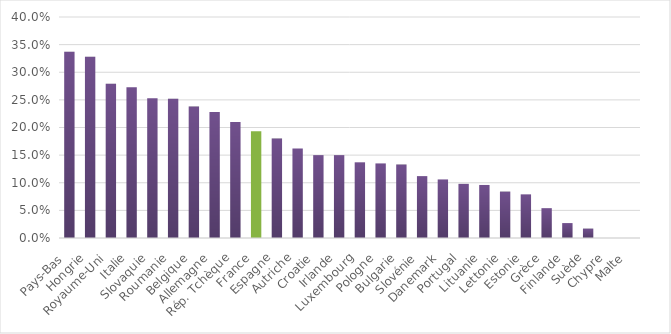
| Category | Series 0 |
|---|---|
| Pays-Bas | 0.337 |
| Hongrie | 0.328 |
| Royaume-Uni | 0.279 |
| Italie | 0.273 |
| Slovaquie | 0.253 |
| Roumanie | 0.252 |
| Belgique | 0.238 |
| Allemagne | 0.228 |
| Rép. Tchèque | 0.21 |
| France | 0.193 |
| Espagne | 0.18 |
| Autriche | 0.162 |
| Croatie | 0.15 |
| Irlande | 0.15 |
| Luxembourg | 0.137 |
| Pologne | 0.135 |
| Bulgarie | 0.133 |
| Slovénie | 0.112 |
| Danemark | 0.106 |
| Portugal | 0.098 |
| Lituanie | 0.096 |
| Lettonie | 0.084 |
| Estonie | 0.079 |
| Grèce | 0.054 |
| Finlande | 0.027 |
| Suède | 0.017 |
| Chypre | 0 |
| Malte | 0 |